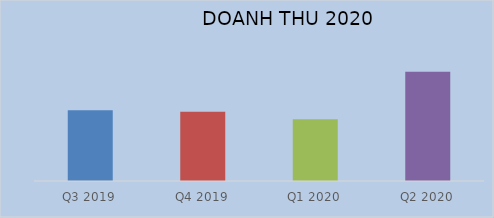
| Category | Series 0 |
|---|---|
| Q3 2019 | 1238823351631 |
| Q4 2019 | 1208882821276 |
| Q1 2020 | 1081711458225 |
| Q2 2020 | 1908635499693 |